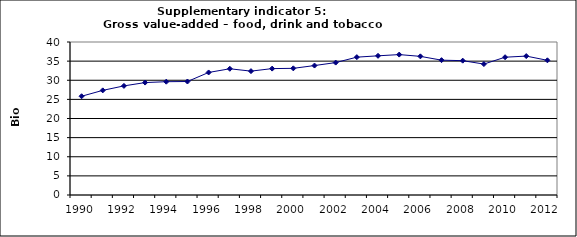
| Category | Gross value-added – food, drink and tobacco industry, Bio Euro (EC95) |
|---|---|
| 1990 | 25.82 |
| 1991 | 27.356 |
| 1992 | 28.523 |
| 1993 | 29.392 |
| 1994 | 29.622 |
| 1995 | 29.673 |
| 1996 | 32.036 |
| 1997 | 32.999 |
| 1998 | 32.385 |
| 1999 | 33.045 |
| 2000 | 33.117 |
| 2001 | 33.844 |
| 2002 | 34.616 |
| 2003 | 36.039 |
| 2004 | 36.388 |
| 2005 | 36.708 |
| 2006 | 36.244 |
| 2007 | 35.253 |
| 2008 | 35.122 |
| 2009 | 34.229 |
| 2010 | 36.023 |
| 2011 | 36.316 |
| 2012 | 35.21 |